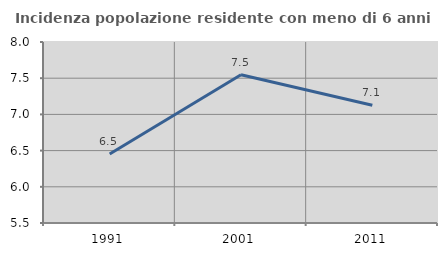
| Category | Incidenza popolazione residente con meno di 6 anni |
|---|---|
| 1991.0 | 6.454 |
| 2001.0 | 7.547 |
| 2011.0 | 7.126 |